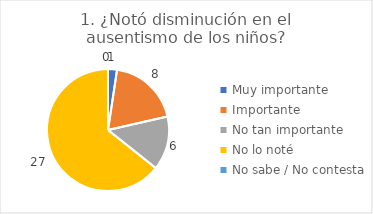
| Category | 1. ¿Notó disminución en el ausentismo de los niños? |
|---|---|
| Muy importante  | 0.024 |
| Importante  | 0.19 |
| No tan importante  | 0.143 |
| No lo noté  | 0.643 |
| No sabe / No contesta | 0 |